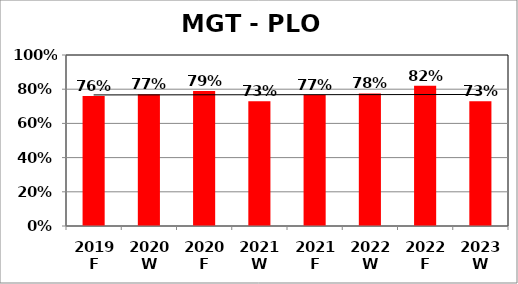
| Category | Series 0 |
|---|---|
| 2019 F | 0.76 |
| 2020 W | 0.77 |
| 2020 F | 0.79 |
| 2021 W | 0.73 |
| 2021 F | 0.768 |
| 2022 W | 0.775 |
| 2022 F | 0.82 |
| 2023 W | 0.73 |